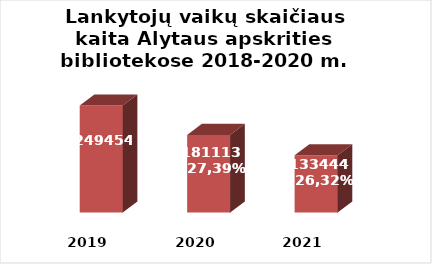
| Category | Series 0 |
|---|---|
| 2019.0 | 249454 |
| 2020.0 | 181113 |
| 2021.0 | 133444 |